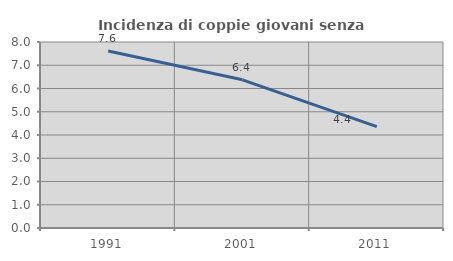
| Category | Incidenza di coppie giovani senza figli |
|---|---|
| 1991.0 | 7.61 |
| 2001.0 | 6.374 |
| 2011.0 | 4.363 |